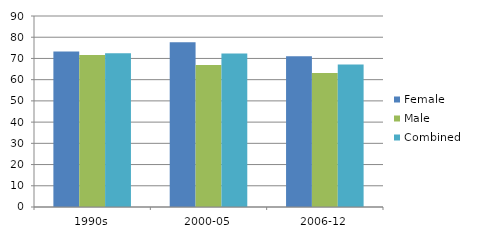
| Category | Female | Male | Combined |
|---|---|---|---|
| 1990s | 73.3 | 71.6 | 72.5 |
| 2000-05 | 77.6 | 66.9 | 72.3 |
| 2006-12 | 71 | 63.2 | 67.1 |